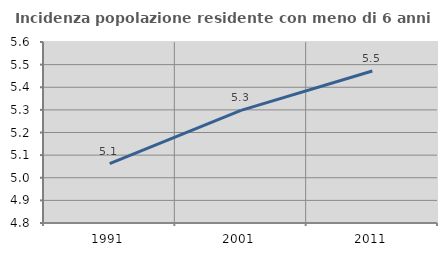
| Category | Incidenza popolazione residente con meno di 6 anni |
|---|---|
| 1991.0 | 5.063 |
| 2001.0 | 5.298 |
| 2011.0 | 5.472 |